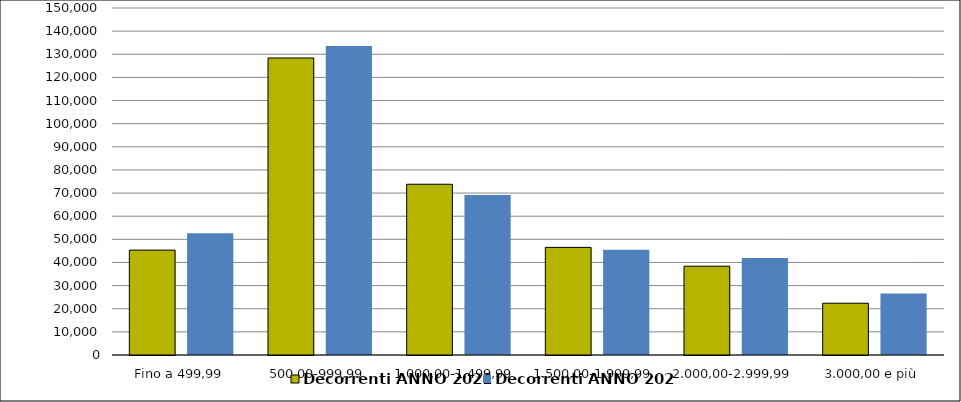
| Category | Decorrenti ANNO 2021 | Decorrenti ANNO 2020 |
|---|---|---|
|  Fino a 499,99  | 45338 | 52651 |
|  500,00-999,99  | 128400 | 133588 |
|  1.000,00-1.499,99  | 73810 | 69173 |
|  1.500,00-1.999,99  | 46513 | 45454 |
|  2.000,00-2.999,99  | 38382 | 41935 |
|  3.000,00 e più  | 22373 | 26600 |